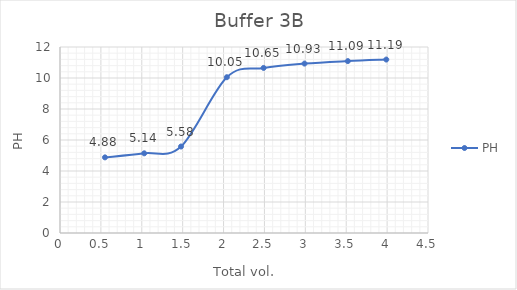
| Category | PH |
|---|---|
| 0.55 | 4.88 |
| 1.03 | 5.14 |
| 1.48 | 5.58 |
| 2.04 | 10.05 |
| 2.49 | 10.65 |
| 2.99 | 10.93 |
| 3.52 | 11.09 |
| 3.99 | 11.19 |